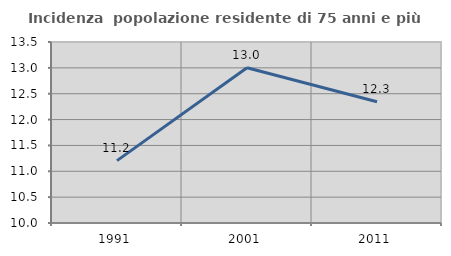
| Category | Incidenza  popolazione residente di 75 anni e più |
|---|---|
| 1991.0 | 11.206 |
| 2001.0 | 13.004 |
| 2011.0 | 12.344 |